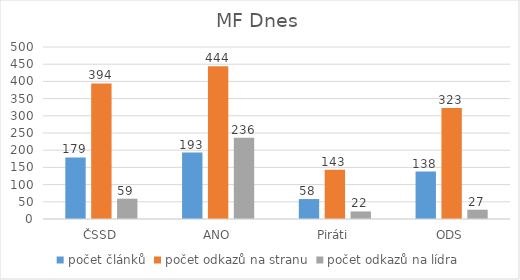
| Category | počet článků | počet odkazů na stranu | počet odkazů na lídra |
|---|---|---|---|
| ČSSD | 179 | 394 | 59 |
| ANO | 193 | 444 | 236 |
| Piráti | 58 | 143 | 22 |
| ODS | 138 | 323 | 27 |